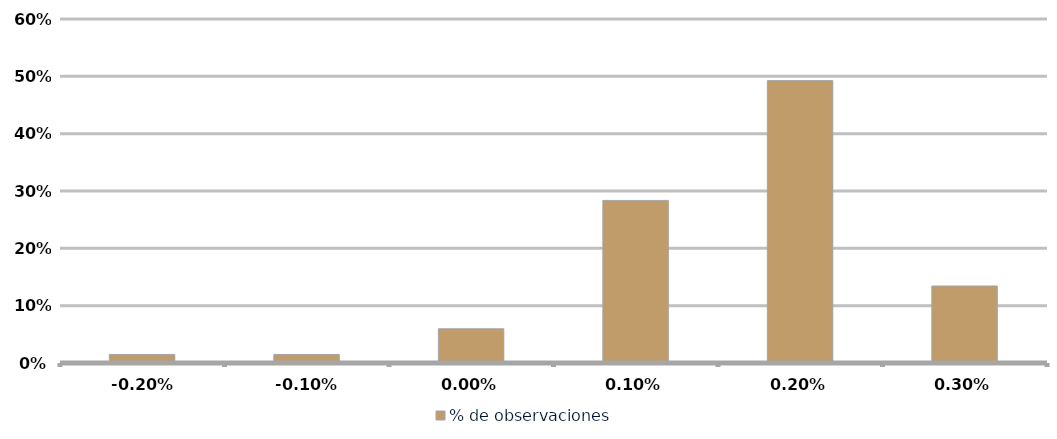
| Category | % de observaciones  |
|---|---|
| -0.002 | 0.015 |
| -0.001 | 0.015 |
| 0.0 | 0.06 |
| 0.001 | 0.284 |
| 0.002 | 0.493 |
| 0.003 | 0.134 |